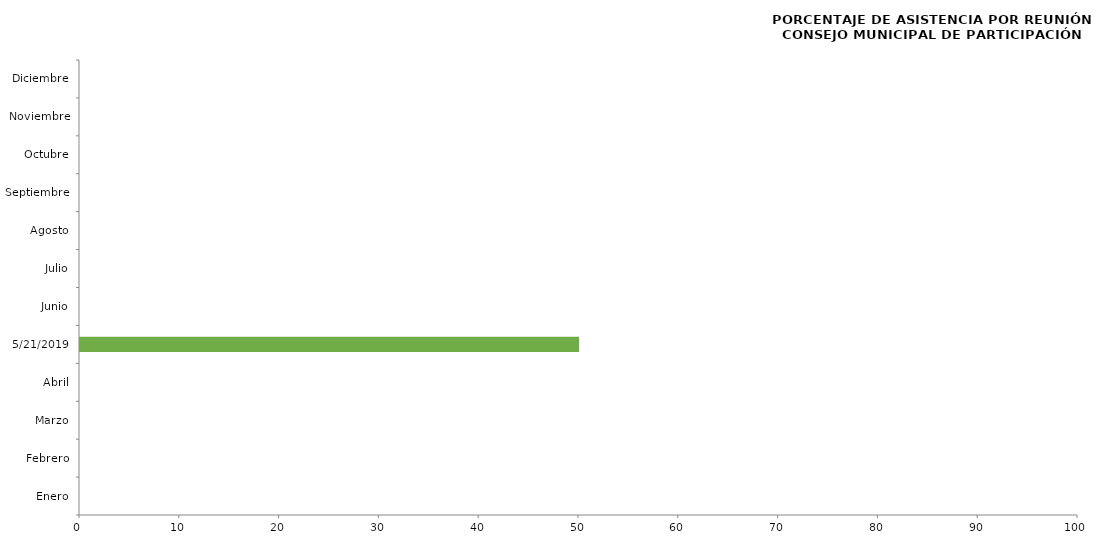
| Category | Series 0 |
|---|---|
| Enero | 0 |
| Febrero | 0 |
| Marzo | 0 |
| Abril | 0 |
| 21/05/2019 | 50 |
| Junio | 0 |
| Julio | 0 |
| Agosto | 0 |
| Septiembre | 0 |
| Octubre | 0 |
| Noviembre | 0 |
| Diciembre | 0 |